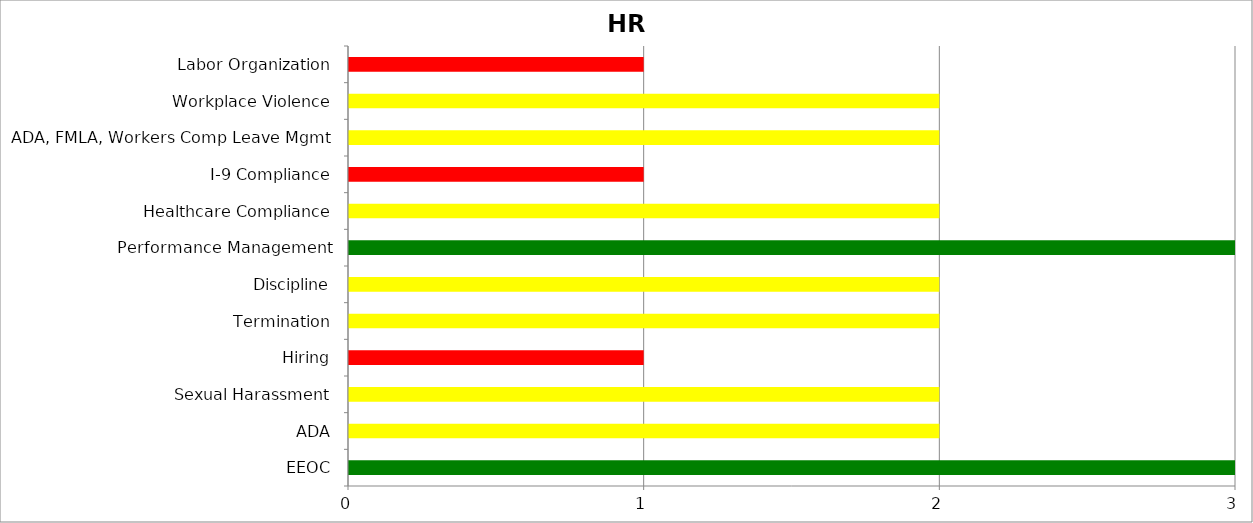
| Category | Low | Medium | High |
|---|---|---|---|
| EEOC | 3 | 0 | 0 |
| ADA | 0 | 2 | 0 |
| Sexual Harassment | 0 | 2 | 0 |
| Hiring | 0 | 0 | 1 |
| Termination | 0 | 2 | 0 |
| Discipline | 0 | 2 | 0 |
| Performance Management | 3 | 0 | 0 |
| Healthcare Compliance | 0 | 2 | 0 |
| I-9 Compliance | 0 | 0 | 1 |
| ADA, FMLA, Workers Comp Leave Mgmt | 0 | 2 | 0 |
| Workplace Violence | 0 | 2 | 0 |
| Labor Organization | 0 | 0 | 1 |